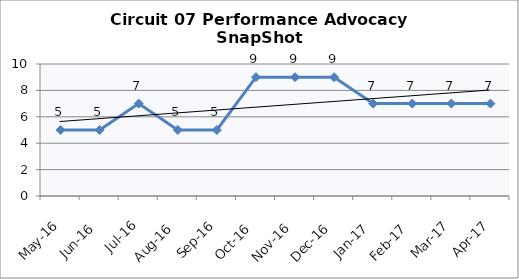
| Category | Circuit 07 |
|---|---|
| May-16 | 5 |
| Jun-16 | 5 |
| Jul-16 | 7 |
| Aug-16 | 5 |
| Sep-16 | 5 |
| Oct-16 | 9 |
| Nov-16 | 9 |
| Dec-16 | 9 |
| Jan-17 | 7 |
| Feb-17 | 7 |
| Mar-17 | 7 |
| Apr-17 | 7 |